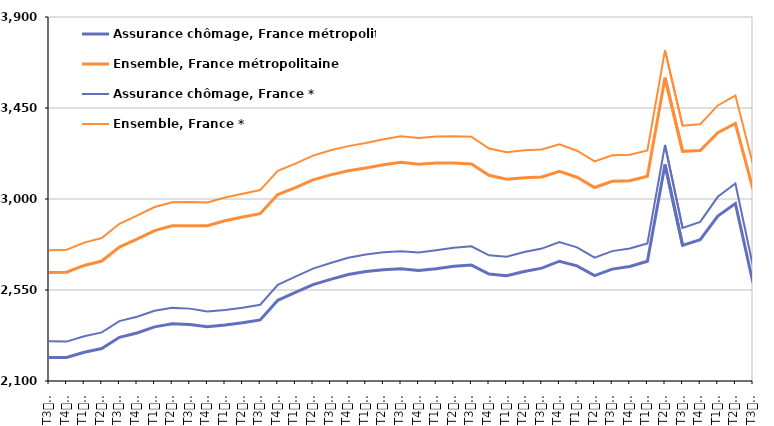
| Category | Assurance chômage, France métropolitaine | Ensemble, France métropolitaine | Assurance chômage, France * | Ensemble, France * |
|---|---|---|---|---|
| T3
2011 | 2216.8 | 2636.3 | 2296 | 2746.6 |
| T4
2011 | 2216 | 2637.9 | 2294.9 | 2749.3 |
| T1
2012 | 2242.1 | 2671.5 | 2321.3 | 2784.3 |
| T2
2012 | 2260.5 | 2693.2 | 2340.2 | 2807.2 |
| T3
2012 | 2316.1 | 2762.2 | 2396.2 | 2877.6 |
| T4
2012 | 2337.5 | 2801.5 | 2417.4 | 2917.7 |
| T1
2013 | 2367.8 | 2843.7 | 2447.3 | 2960.5 |
| T2
2013 | 2382.7 | 2867.2 | 2461.6 | 2984.3 |
| T3
2013 | 2379.9 | 2868.3 | 2457.9 | 2985 |
| T4
2013 | 2368 | 2867.5 | 2444 | 2982.8 |
| T1
2014 | 2376.6 | 2892.6 | 2451.1 | 3007.5 |
| T2
2014 | 2388.1 | 2911.3 | 2462 | 3025.7 |
| T3
2014 | 2401.9 | 2927.3 | 2477 | 3044.2 |
| T4
2014 | 2499 | 3021.9 | 2575.9 | 3139.2 |
| T1
2015 | 2537.9 | 3056.1 | 2616.1 | 3174.8 |
| T2
2015 | 2576.4 | 3094.9 | 2655.6 | 3214.4 |
| T3
2015 | 2602.7 | 3119.5 | 2683.2 | 3240.7 |
| T4
2015 | 2626.7 | 3139.4 | 2709 | 3261.5 |
| T1
2016 | 2641.9 | 3153.4 | 2726 | 3277.2 |
| T2
2016 | 2650.6 | 3169.4 | 2736.2 | 3295.6 |
| T3
2016 | 2655.1 | 3182.1 | 2741.6 | 3310.2 |
| T4
2016 | 2646.4 | 3172.1 | 2735.2 | 3301.1 |
| T1
2017 | 2655.2 | 3178 | 2746.3 | 3309.6 |
| T2
2017 | 2667.2 | 3177.8 | 2759.1 | 3310.7 |
| T3
2017 | 2673.4 | 3173.6 | 2765.9 | 3307.8 |
| T4
2017 | 2629.3 | 3117.5 | 2721.7 | 3249.7 |
| T1
2018 | 2620.8 | 3097.4 | 2714.4 | 3230.9 |
| T2
2018 | 2641.7 | 3105.1 | 2738.2 | 3241.4 |
| T3
2018 | 2658.1 | 3109 | 2754.8 | 3245.3 |
| T4
2018 | 2692.4 | 3136.4 | 2787.6 | 3270.8 |
| T1
2019 | 2669.1 | 3107.7 | 2761 | 3238.6 |
| T2
2019 | 2621 | 3056.9 | 2710.3 | 3185.7 |
| T3
2019 | 2653.3 | 3087.3 | 2742.2 | 3216.2 |
| T4
2019 | 2666.6 | 3090.4 | 2755.1 | 3218.6 |
| T1
2020 | 2692 | 3112.2 | 2780.4 | 3240.3 |
| T2
2020 | 3170.8 | 3600 | 3266.8 | 3736 |
| T3
2020 | 2770.9 | 3235.6 | 2856.4 | 3362 |
| T4
2020 | 2798.7 | 3239.4 | 2887.1 | 3369.4 |
| T1
2021 | 2916 | 3327.6 | 3010.8 | 3462.7 |
| T2
2021 | 2977.6 | 3373.3 | 3076.5 | 3511.5 |
| T3
2021 | 2585.6 | 3048.2 | 2667 | 3171.2 |